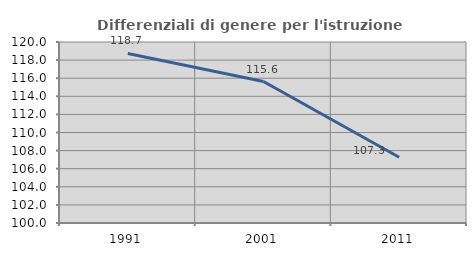
| Category | Differenziali di genere per l'istruzione superiore |
|---|---|
| 1991.0 | 118.735 |
| 2001.0 | 115.628 |
| 2011.0 | 107.268 |